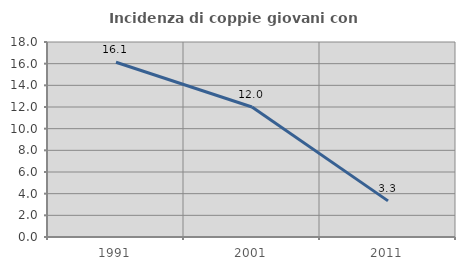
| Category | Incidenza di coppie giovani con figli |
|---|---|
| 1991.0 | 16.129 |
| 2001.0 | 12 |
| 2011.0 | 3.333 |